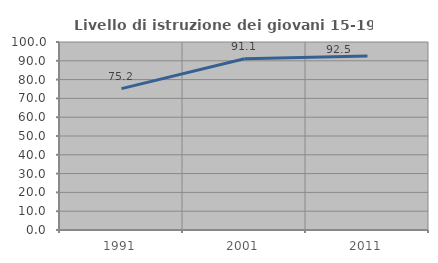
| Category | Livello di istruzione dei giovani 15-19 anni |
|---|---|
| 1991.0 | 75.18 |
| 2001.0 | 91.062 |
| 2011.0 | 92.487 |